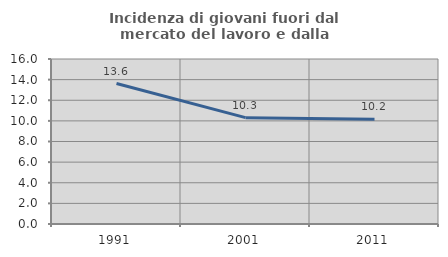
| Category | Incidenza di giovani fuori dal mercato del lavoro e dalla formazione  |
|---|---|
| 1991.0 | 13.617 |
| 2001.0 | 10.314 |
| 2011.0 | 10.169 |